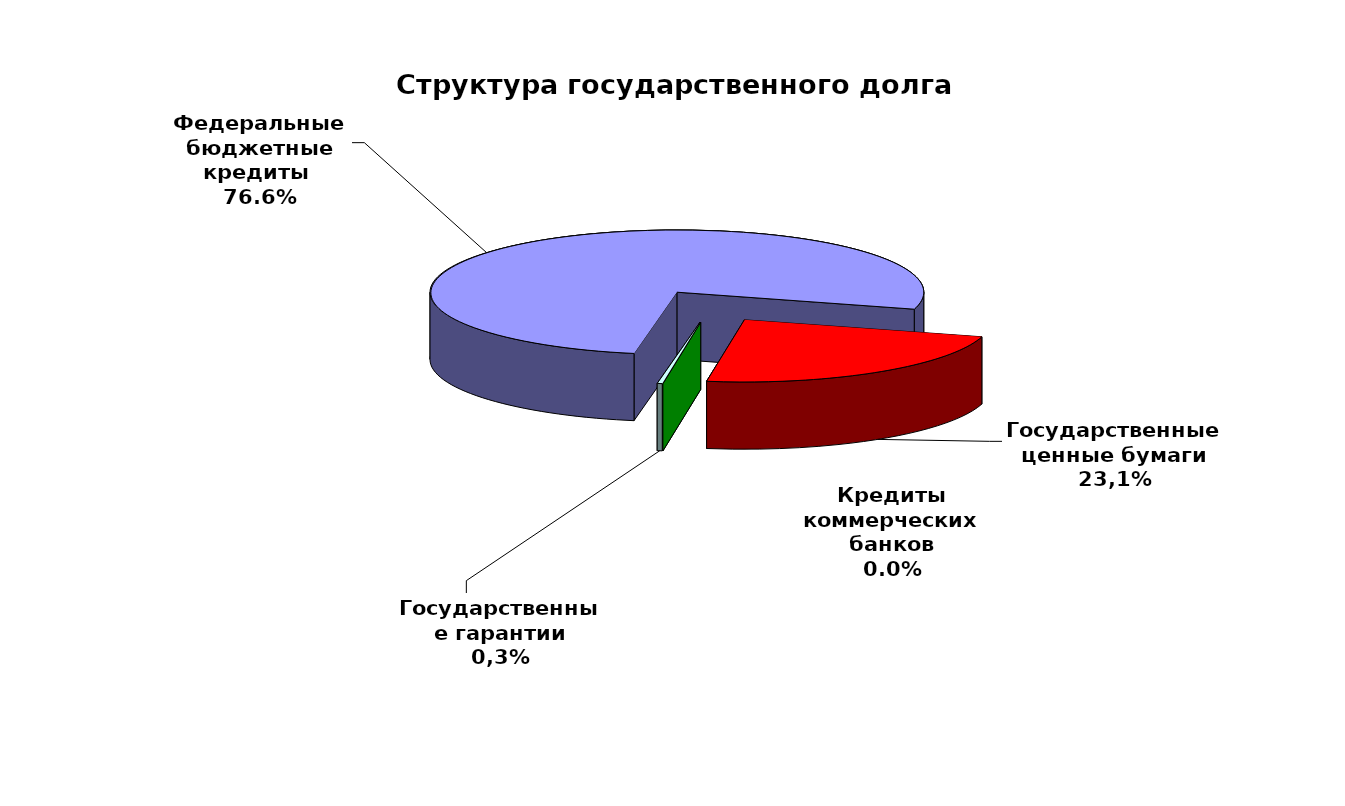
| Category | Series 0 |
|---|---|
| Федеральные бюджетные кредиты  | 113101358.397 |
| Государственные ценные бумаги | 34000000 |
| Кредиты коммерческих банков | 0 |
| Государственные гарантии | 490331.207 |